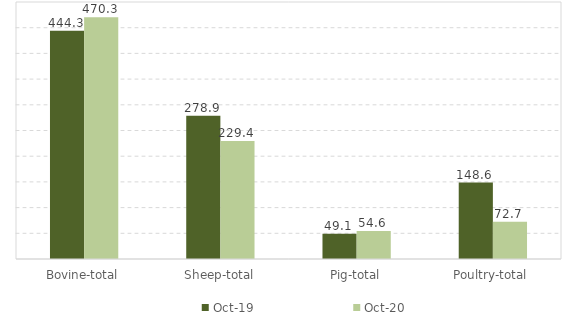
| Category | Oct-19 | Oct-20 |
|---|---|---|
| Bovine-total | 444.3 | 470.3 |
| Sheep-total | 278.9 | 229.4 |
| Pig-total | 49.1 | 54.6 |
| Poultry-total | 148.6 | 72.7 |